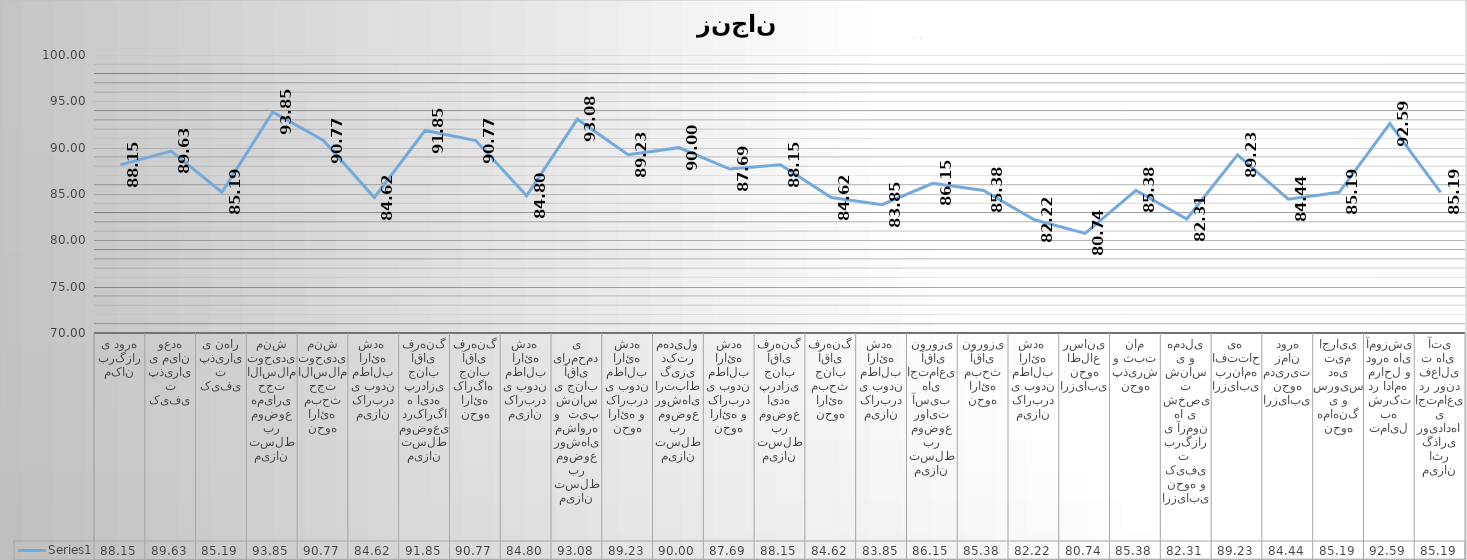
| Category | Series 0 |
|---|---|
| مکان برگزاری دوره | 88.148 |
| کیفیت پذیرایی میان وعده | 89.63 |
| کیفیت پذیرایی نهار | 85.185 |
| میزان تسلط بر موضوع همیاری حجت الاسلام توحیدی منش | 93.846 |
| نحوه ارائه مبحث حجت الاسلام توحیدی منش | 90.769 |
| میزان کاربردی بودن مطالب ارائه شده  | 84.615 |
| میزان تسلط موضوعی درکارگاه ایده پردازی جناب آقای فرهنگ | 91.852 |
| نحوه ارائه کارگاه  جناب آقای فرهنگ | 90.769 |
| میزان کاربردی بودن مطالب ارائه شده  | 84.8 |
| میزان تسلط بر موضوع روشهای مشاوره و  تیپ شناسی جناب آقای یارمحمدی | 93.077 |
| نحوه ارائه و کاربردی بودن مطالب ارائه شده | 89.231 |
| میزان تسلط بر موضوع روشهای ارتباط گیری دکتر مهدیلو | 90 |
| نحوه ارائه و کاربردی بودن مطالب ارائه شده | 87.692 |
| میزان تسلط بر موضوع ایده پردازی جناب آقای فرهنگ | 88.148 |
| نحوه ارائه مبحث جناب آقای فرهنگ | 84.615 |
| میزان کاربردی بودن مطالب ارائه شده  | 83.846 |
| میزان تسلط بر موضوع روایت آسیب های اجتماعی  آقای نوروزی | 86.154 |
| نحوه ارائه مبحث آقای نوروزی | 85.385 |
| میزان کاربردی بودن مطالب ارائه شده  | 82.222 |
| ارزیابی نحوه اطلاع رسانی | 80.741 |
| نحوه پذیرش و ثبت نام | 85.385 |
| ارزیابی نحوه و کیفیت  برگزاری آزمون ها ی شخصیت شناسی و همدلی | 82.308 |
| ارزیابی برنامه افتتاحیه  | 89.231 |
| ارزیابی نحوه مدیریت زمان دوره | 84.444 |
| نحوه هماهنگی و سرویس دهی تیم اجرایی | 85.185 |
| تمایل به شرکت در ادامه مراحل و دوره های آموزشی | 92.593 |
| میزان اثر گذاری رویدادهای اجتماعی در روند فعالیت های  آتی | 85.185 |